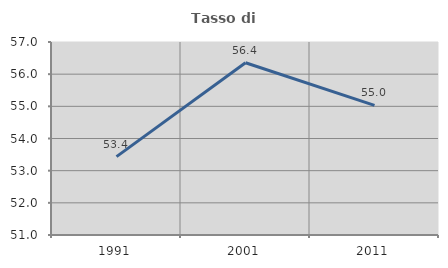
| Category | Tasso di occupazione   |
|---|---|
| 1991.0 | 53.437 |
| 2001.0 | 56.355 |
| 2011.0 | 55.03 |